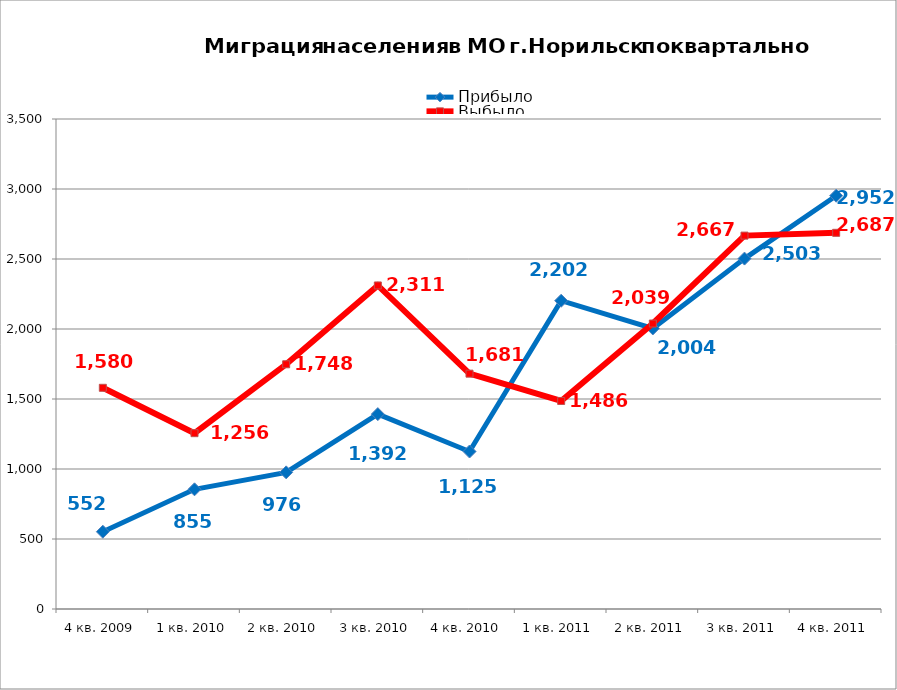
| Category | Прибыло | Выбыло |
|---|---|---|
| 4 кв. 2009 | 552 | 1580 |
| 1 кв. 2010 | 855 | 1256 |
| 2 кв. 2010 | 976 | 1748 |
| 3 кв. 2010 | 1392 | 2311 |
| 4 кв. 2010 | 1125 | 1681 |
| 1 кв. 2011 | 2202 | 1486 |
| 2 кв. 2011 | 2004 | 2039 |
| 3 кв. 2011 | 2503 | 2667 |
| 4 кв. 2011 | 2952 | 2687 |